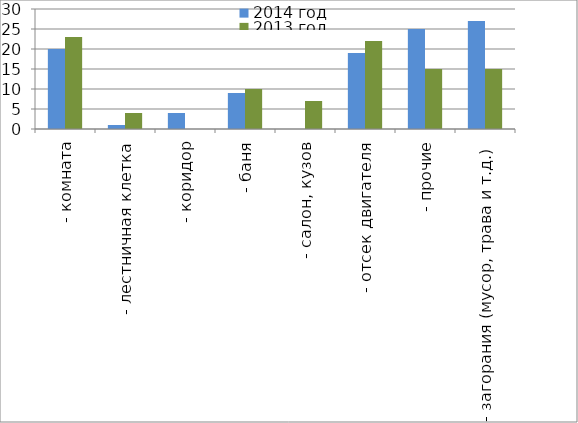
| Category | 2014 год | 2013 год |
|---|---|---|
|  - комната | 20 | 23 |
|  - лестничная клетка | 1 | 4 |
|  - коридор | 4 | 0 |
|  - баня | 9 | 10 |
|  - салон, кузов | 0 | 7 |
|  - отсек двигателя | 19 | 22 |
| - прочие | 25 | 15 |
| - загорания (мусор, трава и т.д.)  | 27 | 15 |